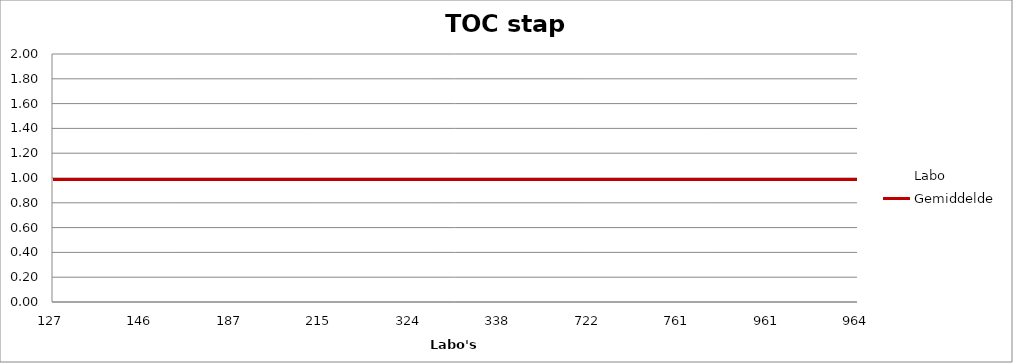
| Category | Labo  | Gemiddelde |
|---|---|---|
| 127.0 | 0.943 | 0.987 |
| 146.0 | 0.952 | 0.987 |
| 187.0 | 1.009 | 0.987 |
| 215.0 | 0.982 | 0.987 |
| 324.0 | 1.014 | 0.987 |
| 338.0 | 1.872 | 0.987 |
| 722.0 | 1.05 | 0.987 |
| 761.0 | 1.014 | 0.987 |
| 961.0 | 0.952 | 0.987 |
| 964.0 | 0.967 | 0.987 |